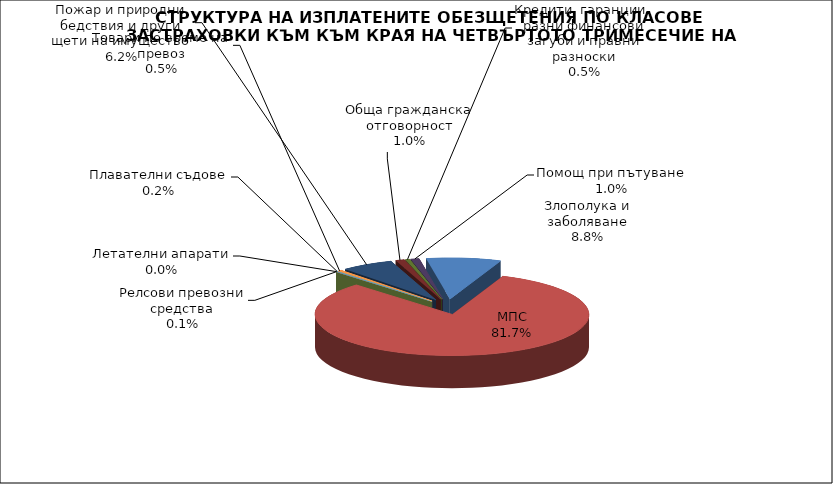
| Category | Злополука и заболяване |
|---|---|
| Злополука и заболяване | 0.088 |
| МПС | 0.817 |
| Релсови превозни средства | 0.001 |
| Летателни апарати | 0 |
| Плавателни съдове | 0.002 |
| Товари по време на превоз | 0.005 |
| Пожар и природни бедствия и други щети на имущество | 0.062 |
| Обща гражданска отговорност | 0.01 |
| Кредити, гаранции, разни финансови загуби и правни разноски | 0.005 |
| Помощ при пътуване | 0.01 |